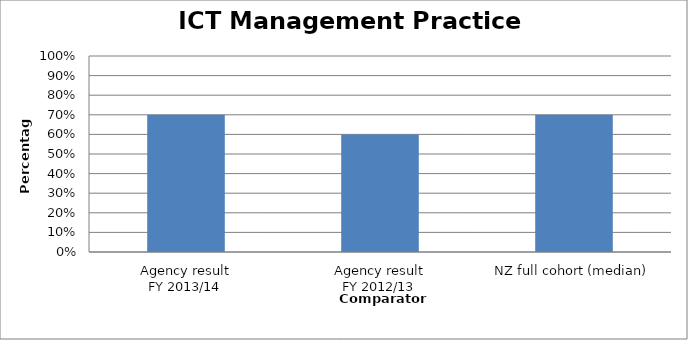
| Category | Result |
|---|---|
| Agency result
FY 2013/14 | 0.7 |
| Agency result
FY 2012/13 | 0.6 |
| NZ full cohort (median) | 0.7 |